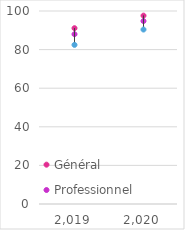
| Category | Général | Professionnel | Technologique |
|---|---|---|---|
| 2019.0 | 91.084 | 87.969 | 82.45 |
| 2020.0 | 97.6 | 94.8 | 90.4 |